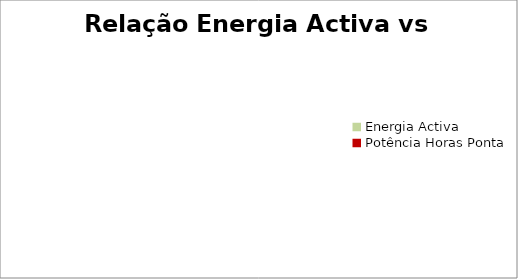
| Category | Total |
|---|---|
| Energia Activa | 0 |
| Potência Horas Ponta | 0 |